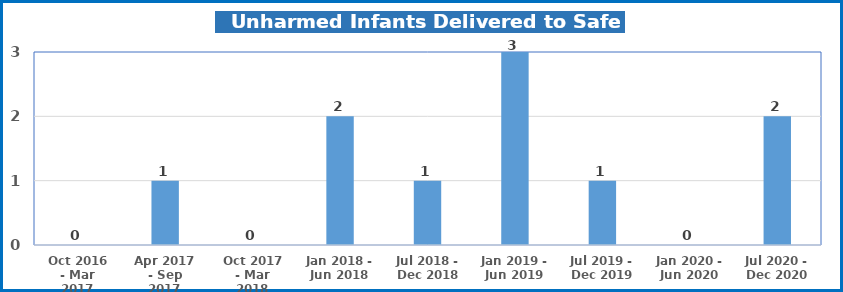
| Category | Unharmed Infants Delivered to Safe Haven |
|---|---|
| Oct 2016 - Mar 2017 | 0 |
| Apr 2017 - Sep 2017 | 1 |
| Oct 2017 - Mar 2018 | 0 |
| Jan 2018 - Jun 2018 | 2 |
| Jul 2018 - Dec 2018 | 1 |
| Jan 2019 - Jun 2019 | 3 |
| Jul 2019 - Dec 2019 | 1 |
| Jan 2020 - Jun 2020 | 0 |
| Jul 2020 - Dec 2020 | 2 |